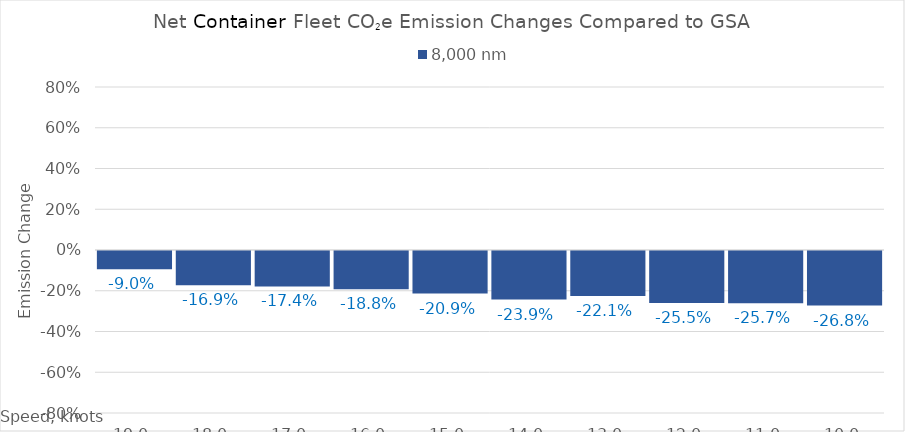
| Category | 8,000 |
|---|---|
| 19.0 | -0.09 |
| 18.0 | -0.169 |
| 17.0 | -0.174 |
| 16.0 | -0.188 |
| 15.0 | -0.209 |
| 14.0 | -0.239 |
| 13.0 | -0.221 |
| 12.0 | -0.255 |
| 11.0 | -0.257 |
| 10.0 | -0.268 |